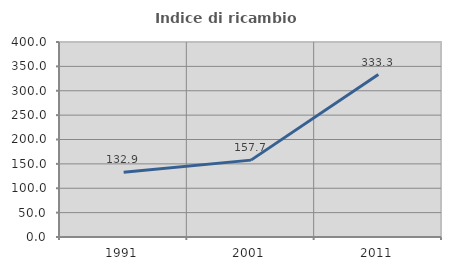
| Category | Indice di ricambio occupazionale  |
|---|---|
| 1991.0 | 132.911 |
| 2001.0 | 157.692 |
| 2011.0 | 333.333 |